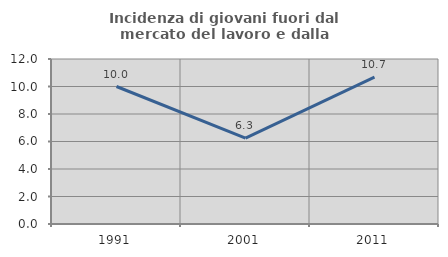
| Category | Incidenza di giovani fuori dal mercato del lavoro e dalla formazione  |
|---|---|
| 1991.0 | 10 |
| 2001.0 | 6.25 |
| 2011.0 | 10.674 |